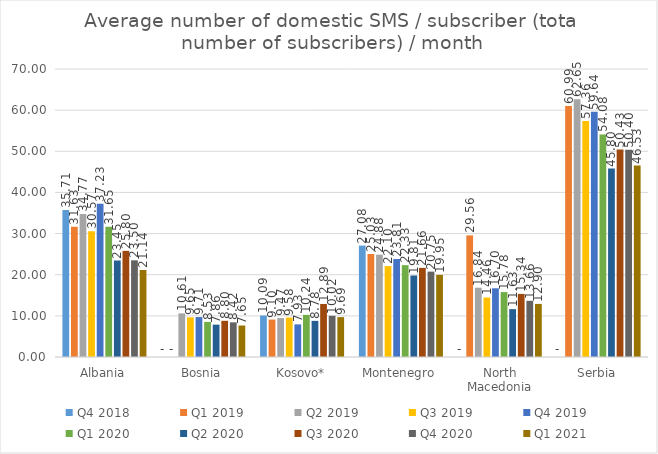
| Category | Q4 2018 | Q1 2019 | Q2 2019 | Q3 2019 | Q4 2019 | Q1 2020 | Q2 2020 | Q3 2020 | Q4 2020 | Q1 2021 |
|---|---|---|---|---|---|---|---|---|---|---|
| Albania | 35.712 | 31.631 | 34.767 | 30.568 | 37.231 | 31.647 | 23.454 | 25.8 | 23.499 | 21.142 |
| Bosnia | 0 | 0 | 10.606 | 9.648 | 9.705 | 8.527 | 7.863 | 8.796 | 8.42 | 7.65 |
| Kosovo* | 10.09 | 9.101 | 9.471 | 9.581 | 7.93 | 10.24 | 8.782 | 12.893 | 10.022 | 9.694 |
| Montenegro | 27.084 | 25.033 | 24.877 | 22.097 | 23.815 | 22.326 | 19.808 | 21.661 | 20.754 | 19.954 |
| North Macedonia | 0 | 29.561 | 16.837 | 14.462 | 16.703 | 15.777 | 11.633 | 15.336 | 13.657 | 12.9 |
| Serbia | 0 | 60.986 | 62.65 | 57.364 | 59.637 | 54.084 | 45.798 | 50.427 | 50.398 | 46.535 |